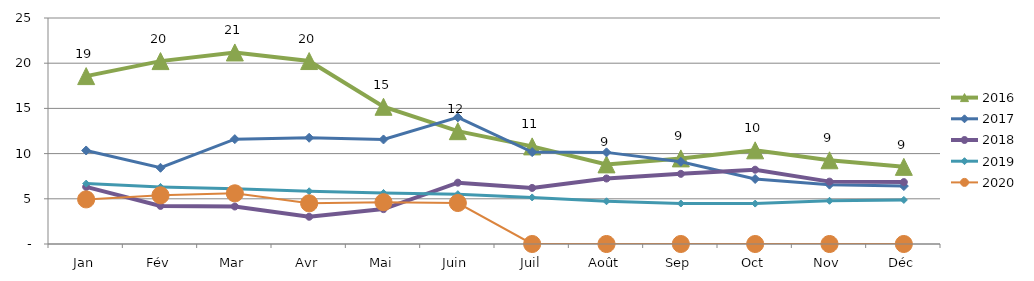
| Category | 2015 | 2016 | 2017 | 2018 | 2019 | 2020 |
|---|---|---|---|---|---|---|
| Jan |  | 18.573 | 10.345 | 6.315 | 6.68 | 4.936 |
| Fév |  | 20.232 | 8.433 | 4.213 | 6.315 | 5.385 |
| Mar |  | 21.188 | 11.601 | 4.15 | 6.109 | 5.606 |
| Avr |  | 20.238 | 11.751 | 3.014 | 5.832 | 4.501 |
| Mai |  | 15.18 | 11.565 | 3.859 | 5.648 | 4.623 |
| Juin |  | 12.479 | 14.003 | 6.784 | 5.512 | 4.535 |
| Juil |  | 10.799 | 10.166 | 6.203 | 5.152 | 0 |
| Août |  | 8.807 | 10.134 | 7.245 | 4.728 | 0 |
| Sep |  | 9.47 | 9.094 | 7.761 | 4.477 | 0 |
| Oct |  | 10.362 | 7.192 | 8.218 | 4.47 | 0 |
| Nov |  | 9.261 | 6.564 | 6.9 | 4.782 | 0 |
| Déc |  | 8.534 | 6.409 | 6.846 | 4.875 | 0 |